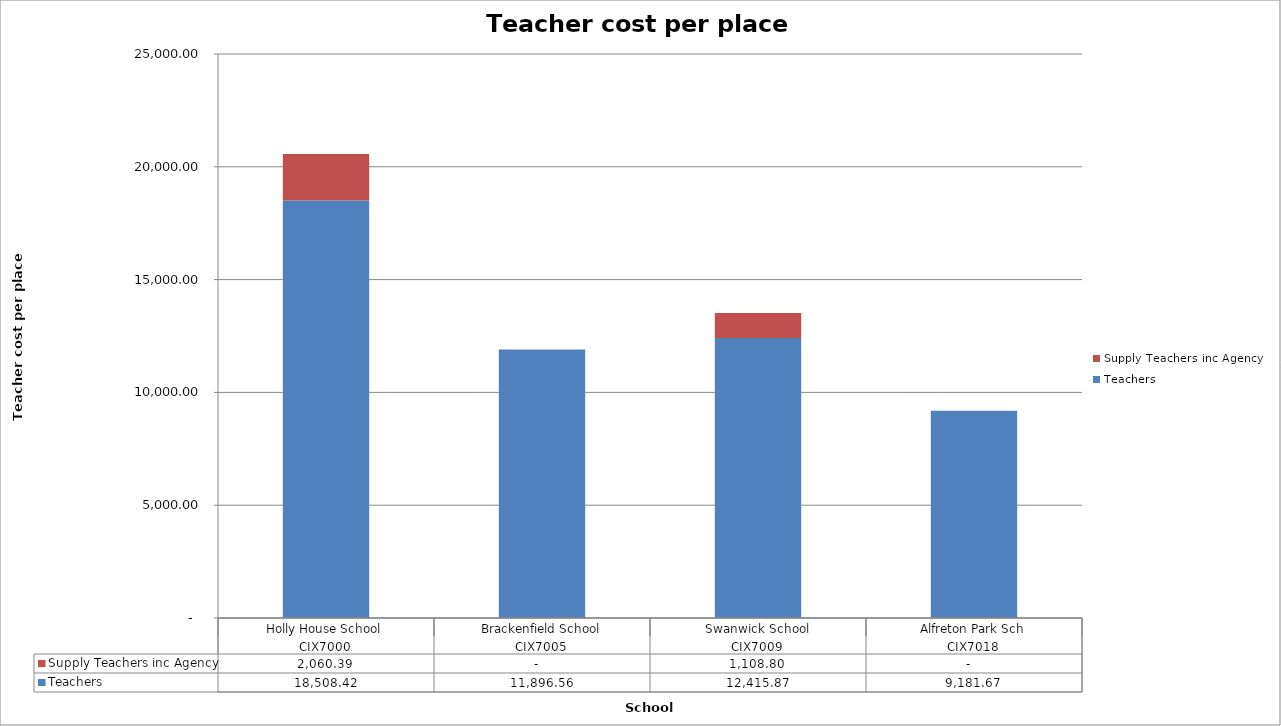
| Category | Teachers | Supply Teachers inc Agency |
|---|---|---|
| 0 | 18508.415 | 2060.385 |
| 1 | 11896.562 | 0 |
| 2 | 12415.872 | 1108.804 |
| 3 | 9181.672 | 0 |